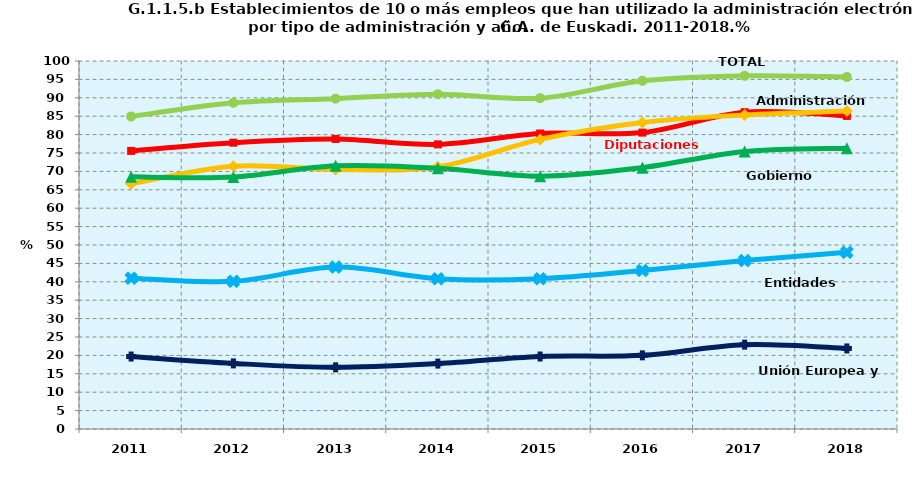
| Category | TOTAL | Diputaciones Forales | Administración Central | Gobierno Vasco | Entidades Locales | Unión Europea y Otros |
|---|---|---|---|---|---|---|
| 2011.0 | 84.919 | 75.566 | 66.635 | 68.518 | 40.99 | 19.69 |
| 2012.0 | 88.639 | 77.803 | 71.399 | 68.457 | 40.12 | 17.825 |
| 2013.0 | 89.774 | 78.814 | 70.5 | 71.513 | 43.99 | 16.752 |
| 2014.0 | 90.972 | 77.343 | 71.245 | 70.852 | 40.845 | 17.779 |
| 2015.0 | 89.9 | 80.3 | 78.7 | 68.7 | 40.845 | 19.7 |
| 2016.0 | 94.63 | 80.543 | 83.285 | 71.025 | 43.062 | 20.023 |
| 2017.0 | 95.964 | 86.074 | 85.341 | 75.396 | 45.758 | 22.918 |
| 2018.0 | 95.655 | 85.076 | 86.41 | 76.28 | 48.003 | 21.89 |